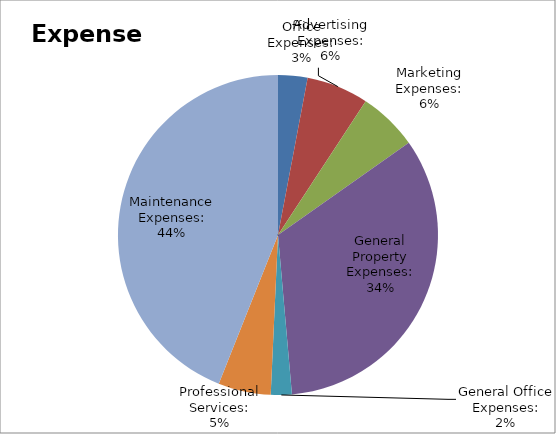
| Category | Series 0 |
|---|---|
| Office Expenses: | 13907 |
| Advertising Expenses: | 29300 |
| Marketing Expenses: | 28068 |
| General Property Expenses: | 156240 |
| General Office Expenses: | 9902 |
| Professional Services: | 24852 |
| Maintenance Expenses: | 205764 |